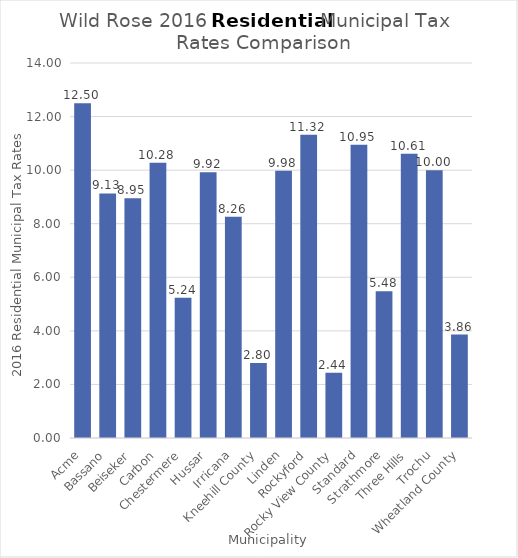
| Category | Residential Municipal Tax Rates |
|---|---|
| Acme | 12.5 |
| Bassano | 9.13 |
| Beiseker | 8.95 |
| Carbon | 10.28 |
| Chestermere | 5.24 |
| Hussar | 9.92 |
| Irricana | 8.26 |
| Kneehill County | 2.8 |
| Linden | 9.98 |
| Rockyford | 11.32 |
| Rocky View County | 2.44 |
| Standard | 10.95 |
| Strathmore | 5.48 |
| Three Hills | 10.61 |
| Trochu | 10 |
| Wheatland County | 3.86 |